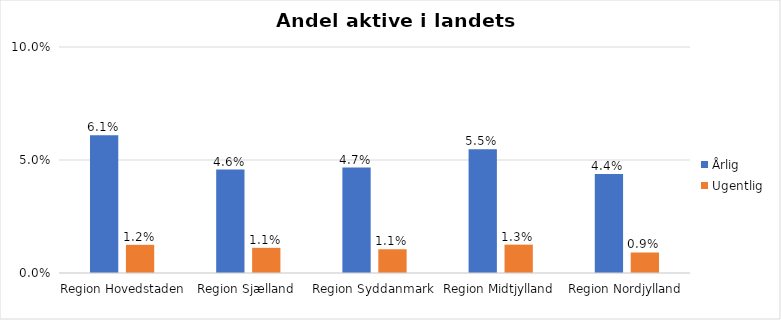
| Category | Årlig | Ugentlig |
|---|---|---|
| Region Hovedstaden | 0.061 | 0.012 |
| Region Sjælland | 0.046 | 0.011 |
| Region Syddanmark | 0.047 | 0.011 |
| Region Midtjylland | 0.055 | 0.013 |
| Region Nordjylland | 0.044 | 0.009 |